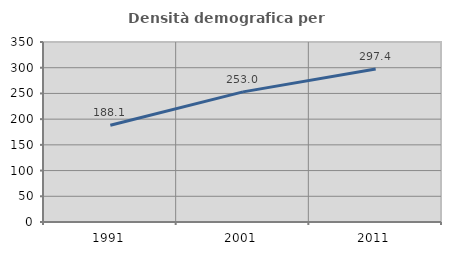
| Category | Densità demografica |
|---|---|
| 1991.0 | 188.119 |
| 2001.0 | 253.012 |
| 2011.0 | 297.399 |